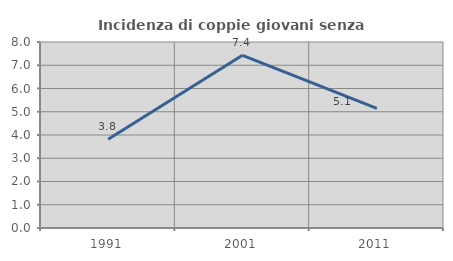
| Category | Incidenza di coppie giovani senza figli |
|---|---|
| 1991.0 | 3.82 |
| 2001.0 | 7.427 |
| 2011.0 | 5.148 |